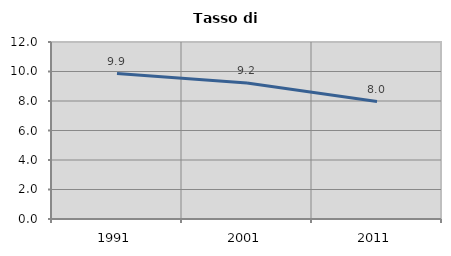
| Category | Tasso di disoccupazione   |
|---|---|
| 1991.0 | 9.858 |
| 2001.0 | 9.213 |
| 2011.0 | 7.964 |